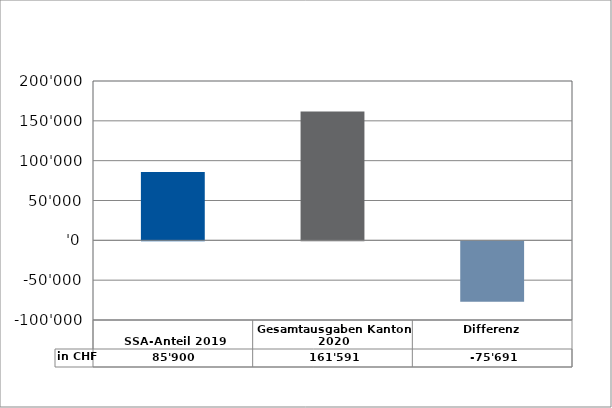
| Category | in CHF |
|---|---|
| 
SSA-Anteil 2019

 | 85900 |
| Gesamtausgaben Kanton 2020
 | 161591 |
| Differenz | -75691 |